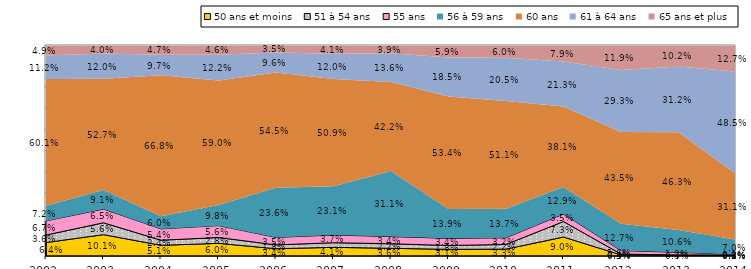
| Category | 50 ans et moins | 51 à 54 ans | 55 ans | 56 à 59 ans | 60 ans | 61 à 64 ans | 65 ans et plus |
|---|---|---|---|---|---|---|---|
| 2002.0 | 0.064 | 0.036 | 0.067 | 0.072 | 0.601 | 0.112 | 0.049 |
| 2003.0 | 0.101 | 0.056 | 0.065 | 0.091 | 0.527 | 0.12 | 0.04 |
| 2004.0 | 0.051 | 0.024 | 0.054 | 0.06 | 0.668 | 0.097 | 0.047 |
| 2005.0 | 0.06 | 0.028 | 0.056 | 0.098 | 0.59 | 0.122 | 0.046 |
| 2006.0 | 0.034 | 0.018 | 0.035 | 0.236 | 0.545 | 0.096 | 0.035 |
| 2007.0 | 0.041 | 0.022 | 0.037 | 0.231 | 0.509 | 0.12 | 0.041 |
| 2008.0 | 0.036 | 0.022 | 0.034 | 0.311 | 0.422 | 0.136 | 0.039 |
| 2009.0 | 0.031 | 0.018 | 0.034 | 0.139 | 0.534 | 0.185 | 0.059 |
| 2010.0 | 0.033 | 0.022 | 0.032 | 0.137 | 0.511 | 0.205 | 0.06 |
| 2011.0 | 0.09 | 0.073 | 0.035 | 0.129 | 0.381 | 0.213 | 0.079 |
| 2012.0 | 0.005 | 0.004 | 0.016 | 0.127 | 0.435 | 0.293 | 0.119 |
| 2013.0 | 0.003 | 0.002 | 0.012 | 0.106 | 0.463 | 0.312 | 0.102 |
| 2014.0 | 0.002 | 0.003 | 0.003 | 0.07 | 0.311 | 0.485 | 0.127 |